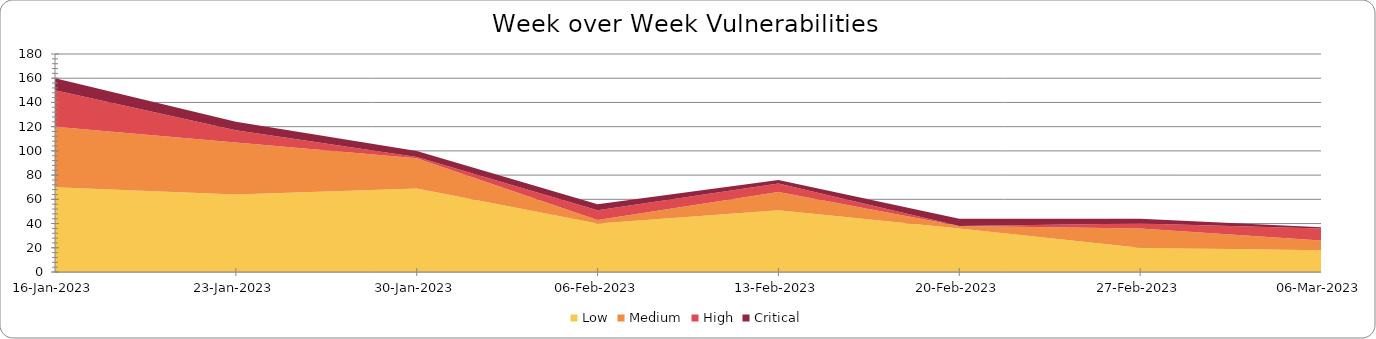
| Category | Low | Medium | High | Critical |
|---|---|---|---|---|
| 2023-03-06 | 18 | 8 | 10 | 1 |
| 2023-02-27 | 20 | 16 | 4 | 4 |
| 2023-02-20 | 36 | 2 | 0 | 6 |
| 2023-02-13 | 51 | 15 | 7 | 3 |
| 2023-02-06 | 40 | 3 | 8 | 5 |
| 2023-01-30 | 69 | 25 | 1 | 5 |
| 2023-01-23 | 64 | 43 | 10 | 7 |
| 2023-01-16 | 70 | 50 | 30 | 10 |